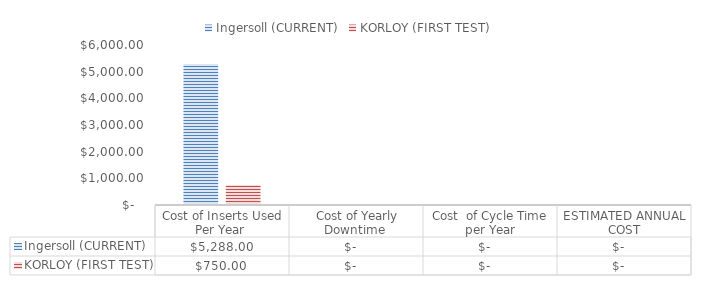
| Category | Ingersoll (CURRENT) | KORLOY (FIRST TEST) |
|---|---|---|
| Cost of Inserts Used Per Year  | 5288 | 750 |
|  Cost of Yearly Downtime  | 0 | 0 |
| Cost  of Cycle Time per Year | 0 | 0 |
| ESTIMATED ANNUAL COST | 0 | 0 |